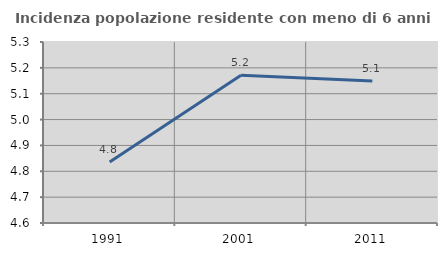
| Category | Incidenza popolazione residente con meno di 6 anni |
|---|---|
| 1991.0 | 4.836 |
| 2001.0 | 5.172 |
| 2011.0 | 5.149 |